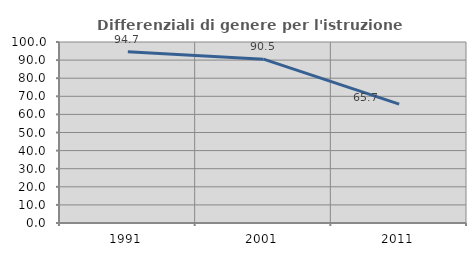
| Category | Differenziali di genere per l'istruzione superiore |
|---|---|
| 1991.0 | 94.654 |
| 2001.0 | 90.506 |
| 2011.0 | 65.714 |